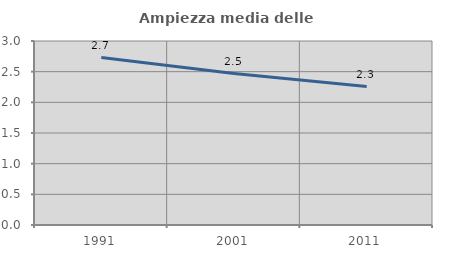
| Category | Ampiezza media delle famiglie |
|---|---|
| 1991.0 | 2.73 |
| 2001.0 | 2.47 |
| 2011.0 | 2.257 |